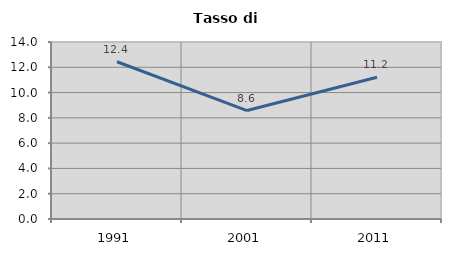
| Category | Tasso di disoccupazione   |
|---|---|
| 1991.0 | 12.438 |
| 2001.0 | 8.579 |
| 2011.0 | 11.207 |